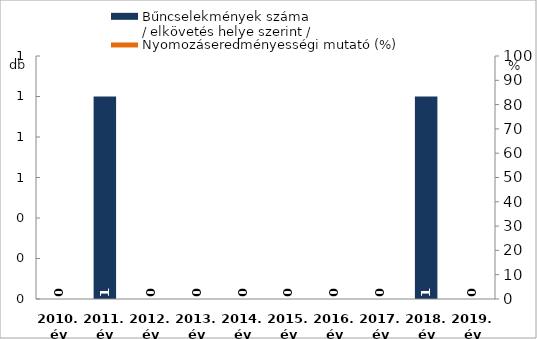
| Category | Bűncselekmények száma
/ elkövetés helye szerint / |
|---|---|
| 2010. év | 0 |
| 2011. év | 1 |
| 2012. év | 0 |
| 2013. év | 0 |
| 2014. év | 0 |
| 2015. év | 0 |
| 2016. év | 0 |
| 2017. év | 0 |
| 2018. év | 1 |
| 2019. év | 0 |